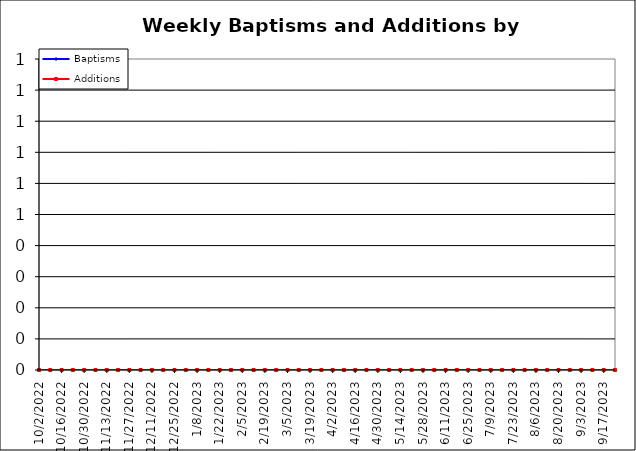
| Category | Baptisms | Additions |
|---|---|---|
| 10/2/22 | 0 | 0 |
| 10/9/22 | 0 | 0 |
| 10/16/22 | 0 | 0 |
| 10/23/22 | 0 | 0 |
| 10/30/22 | 0 | 0 |
| 11/6/22 | 0 | 0 |
| 11/13/22 | 0 | 0 |
| 11/20/22 | 0 | 0 |
| 11/27/22 | 0 | 0 |
| 12/4/22 | 0 | 0 |
| 12/11/22 | 0 | 0 |
| 12/18/22 | 0 | 0 |
| 12/25/22 | 0 | 0 |
| 1/1/23 | 0 | 0 |
| 1/8/23 | 0 | 0 |
| 1/15/23 | 0 | 0 |
| 1/22/23 | 0 | 0 |
| 1/29/23 | 0 | 0 |
| 2/5/23 | 0 | 0 |
| 2/12/23 | 0 | 0 |
| 2/19/23 | 0 | 0 |
| 2/26/23 | 0 | 0 |
| 3/5/23 | 0 | 0 |
| 3/12/23 | 0 | 0 |
| 3/19/23 | 0 | 0 |
| 3/26/23 | 0 | 0 |
| 4/2/23 | 0 | 0 |
| 4/9/23 | 0 | 0 |
| 4/16/23 | 0 | 0 |
| 4/23/23 | 0 | 0 |
| 4/30/23 | 0 | 0 |
| 5/7/23 | 0 | 0 |
| 5/14/23 | 0 | 0 |
| 5/21/23 | 0 | 0 |
| 5/28/23 | 0 | 0 |
| 6/4/23 | 0 | 0 |
| 6/11/23 | 0 | 0 |
| 6/18/23 | 0 | 0 |
| 6/25/23 | 0 | 0 |
| 7/2/23 | 0 | 0 |
| 7/9/23 | 0 | 0 |
| 7/16/23 | 0 | 0 |
| 7/23/23 | 0 | 0 |
| 7/30/23 | 0 | 0 |
| 8/6/23 | 0 | 0 |
| 8/13/23 | 0 | 0 |
| 8/20/23 | 0 | 0 |
| 8/27/23 | 0 | 0 |
| 9/3/23 | 0 | 0 |
| 9/10/23 | 0 | 0 |
| 9/17/23 | 0 | 0 |
| 9/24/23 | 0 | 0 |